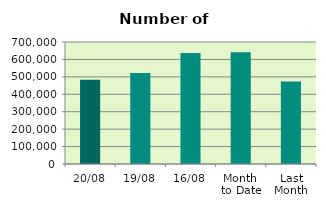
| Category | Series 0 |
|---|---|
| 20/08 | 483058 |
| 19/08 | 522636 |
| 16/08 | 636238 |
| Month 
to Date | 641894.286 |
| Last
Month | 472929.565 |